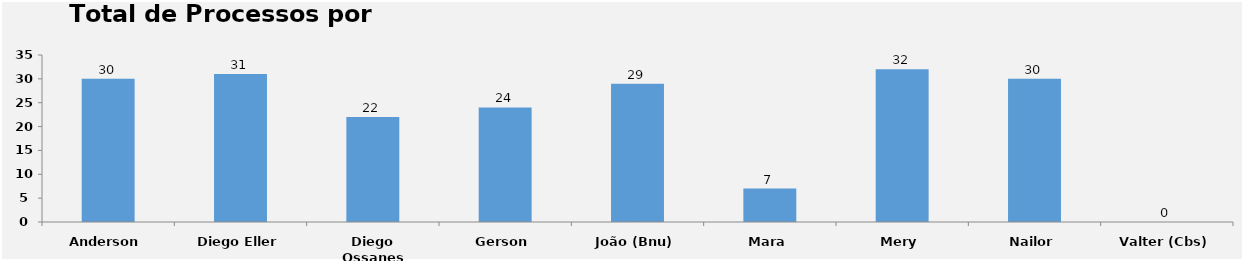
| Category | Series 0 |
|---|---|
| Anderson | 30 |
| Diego Eller | 31 |
| Diego Ossanes | 22 |
| Gerson | 24 |
| João (Bnu) | 29 |
| Mara | 7 |
| Mery | 32 |
| Nailor | 30 |
| Valter (Cbs) | 0 |